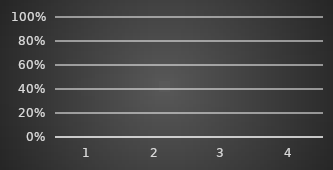
| Category | Series 1 |
|---|---|
| 0 | 0 |
| 1 | 0 |
| 2 | 0 |
| 3 | 0 |